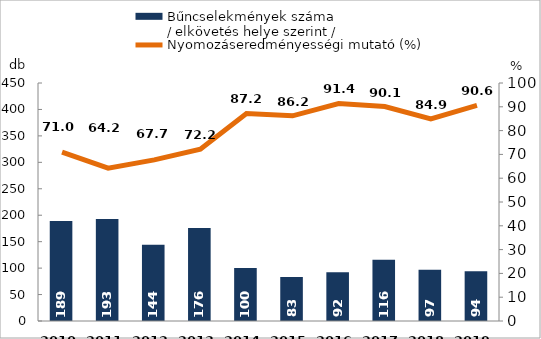
| Category | Bűncselekmények száma
/ elkövetés helye szerint / |
|---|---|
| 2010. év | 189 |
| 2011. év | 193 |
| 2012. év | 144 |
| 2013. év | 176 |
| 2014. év | 100 |
| 2015. év | 83 |
| 2016. év | 92 |
| 2017. év | 116 |
| 2018. év | 97 |
| 2019. év | 94 |